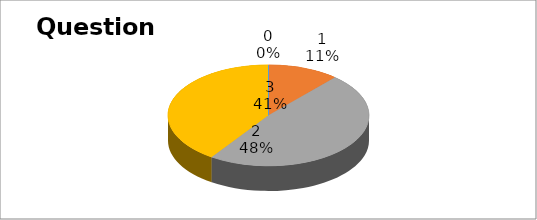
| Category | Series 0 |
|---|---|
| 0 | 0 |
| 1 | 15 |
| 2 | 63 |
| 3 | 53 |